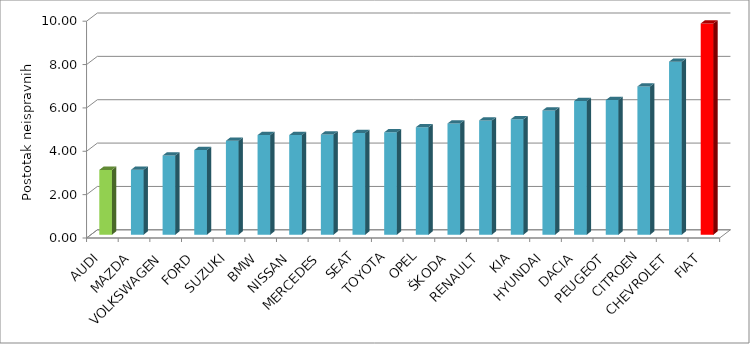
| Category | Series 4 |
|---|---|
| AUDI | 2.986 |
| MAZDA | 2.991 |
| VOLKSWAGEN | 3.65 |
| FORD | 3.902 |
| SUZUKI | 4.33 |
| BMW | 4.59 |
| NISSAN | 4.592 |
| MERCEDES | 4.622 |
| SEAT | 4.685 |
| TOYOTA | 4.72 |
| OPEL | 4.955 |
| ŠKODA | 5.127 |
| RENAULT | 5.268 |
| KIA | 5.326 |
| HYUNDAI | 5.728 |
| DACIA | 6.163 |
| PEUGEOT | 6.206 |
| CITROEN | 6.834 |
| CHEVROLET | 7.978 |
| FIAT | 9.743 |